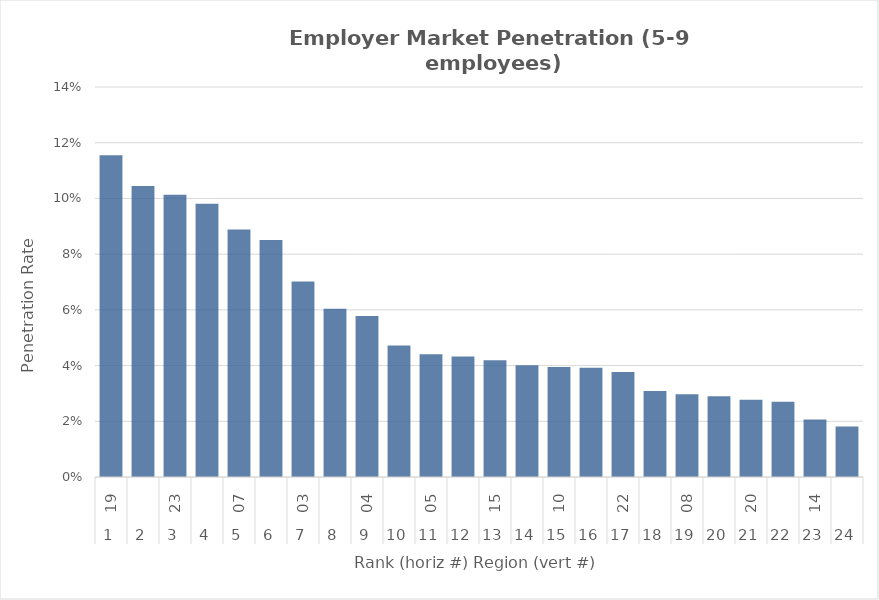
| Category | Rate |
|---|---|
| 0 | 0.116 |
| 1 | 0.104 |
| 2 | 0.101 |
| 3 | 0.098 |
| 4 | 0.089 |
| 5 | 0.085 |
| 6 | 0.07 |
| 7 | 0.06 |
| 8 | 0.058 |
| 9 | 0.047 |
| 10 | 0.044 |
| 11 | 0.043 |
| 12 | 0.042 |
| 13 | 0.04 |
| 14 | 0.04 |
| 15 | 0.039 |
| 16 | 0.038 |
| 17 | 0.031 |
| 18 | 0.03 |
| 19 | 0.029 |
| 20 | 0.028 |
| 21 | 0.027 |
| 22 | 0.021 |
| 23 | 0.018 |